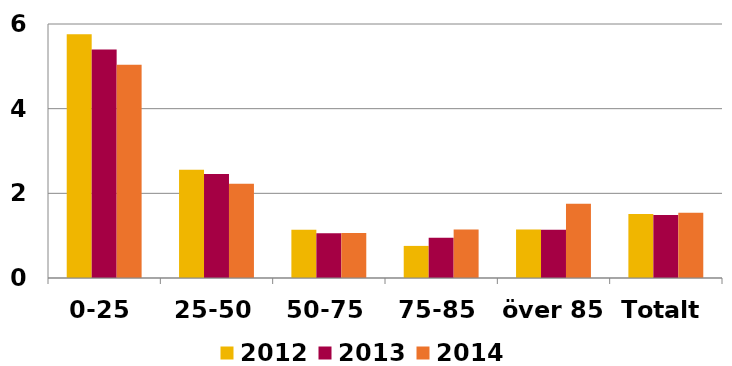
| Category | 2012 | 2013 | 2014 |
|---|---|---|---|
| 0-25 | 5.757 | 5.396 | 5.035 |
| 25-50 | 2.556 | 2.456 | 2.227 |
| 50-75 | 1.138 | 1.056 | 1.063 |
| 75-85 | 0.758 | 0.949 | 1.144 |
| över 85 | 1.144 | 1.142 | 1.754 |
| Totalt | 1.509 | 1.486 | 1.54 |